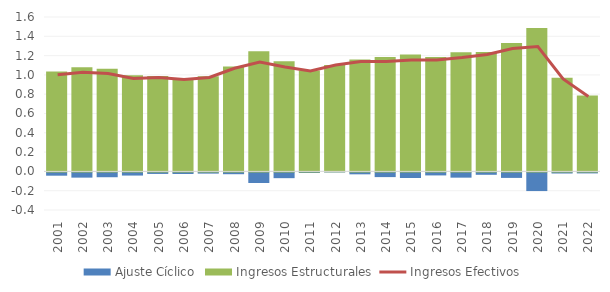
| Category | Ajuste Cíclico | Ingresos Estructurales |
|---|---|---|
| 2001.0 | -0.034 | 1.036 |
| 2002.0 | -0.054 | 1.08 |
| 2003.0 | -0.05 | 1.065 |
| 2004.0 | -0.033 | 0.997 |
| 2005.0 | -0.016 | 0.989 |
| 2006.0 | -0.017 | 0.968 |
| 2007.0 | -0.013 | 0.986 |
| 2008.0 | -0.019 | 1.088 |
| 2009.0 | -0.11 | 1.244 |
| 2010.0 | -0.06 | 1.141 |
| 2011.0 | -0.006 | 1.047 |
| 2012.0 | 0.003 | 1.1 |
| 2013.0 | -0.02 | 1.159 |
| 2014.0 | -0.049 | 1.187 |
| 2015.0 | -0.058 | 1.212 |
| 2016.0 | -0.031 | 1.186 |
| 2017.0 | -0.054 | 1.235 |
| 2018.0 | -0.025 | 1.237 |
| 2019.0 | -0.057 | 1.33 |
| 2020.0 | -0.193 | 1.487 |
| 2021.0 | -0.011 | 0.97 |
| 2022.0 | -0.01 | 0.786 |